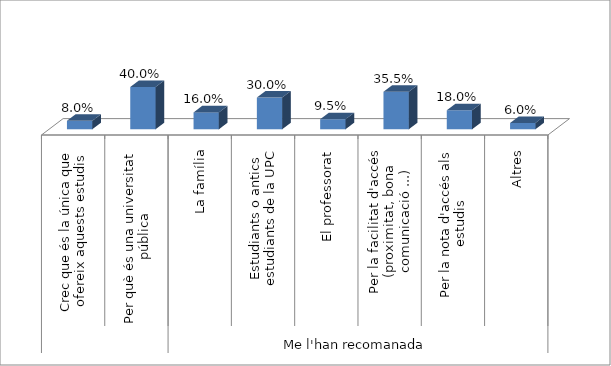
| Category | Grau en Estudis d'Arquitectura |
|---|---|
| 0 | 0.08 |
| 1 | 0.4 |
| 2 | 0.16 |
| 3 | 0.3 |
| 4 | 0.095 |
| 5 | 0.355 |
| 6 | 0.18 |
| 7 | 0.06 |